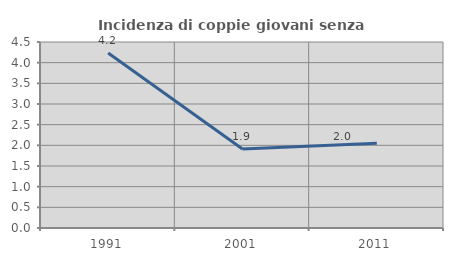
| Category | Incidenza di coppie giovani senza figli |
|---|---|
| 1991.0 | 4.235 |
| 2001.0 | 1.913 |
| 2011.0 | 2.049 |